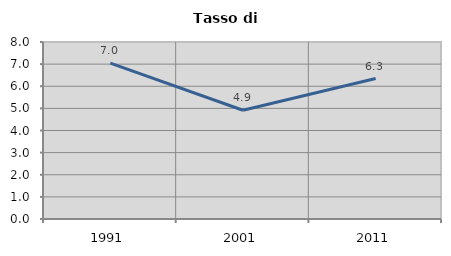
| Category | Tasso di disoccupazione   |
|---|---|
| 1991.0 | 7.042 |
| 2001.0 | 4.916 |
| 2011.0 | 6.349 |